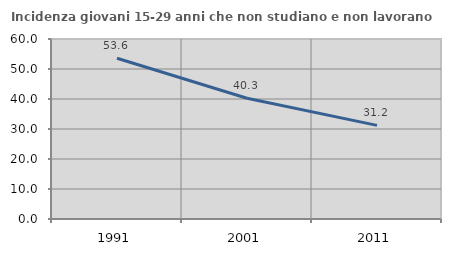
| Category | Incidenza giovani 15-29 anni che non studiano e non lavorano  |
|---|---|
| 1991.0 | 53.571 |
| 2001.0 | 40.263 |
| 2011.0 | 31.2 |